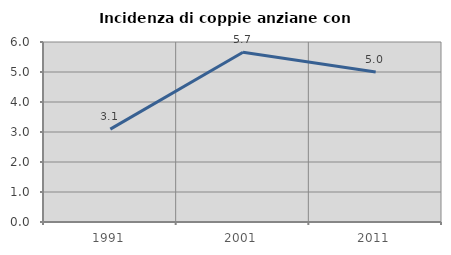
| Category | Incidenza di coppie anziane con figli |
|---|---|
| 1991.0 | 3.097 |
| 2001.0 | 5.66 |
| 2011.0 | 5 |